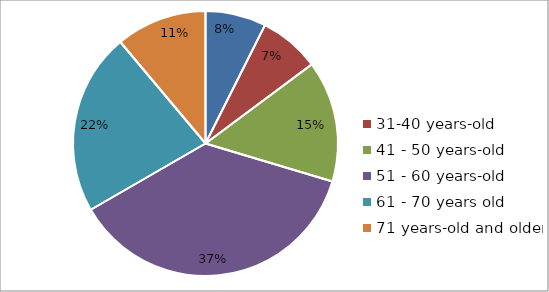
| Category | Series 0 |
|---|---|
| 20 - 30 years-old | 2 |
| 31-40 years-old | 2 |
| 41 - 50 years-old | 4 |
| 51 - 60 years-old | 10 |
| 61 - 70 years old | 6 |
| 71 years-old and older | 3 |